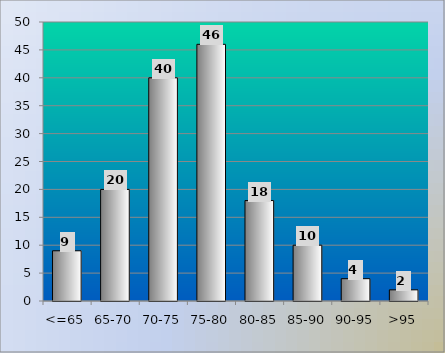
| Category | Series 0 |
|---|---|
| <=65 | 9 |
| 65-70 | 20 |
| 70-75 | 40 |
| 75-80 | 46 |
| 80-85 | 18 |
| 85-90 | 10 |
| 90-95 | 4 |
| >95 | 2 |